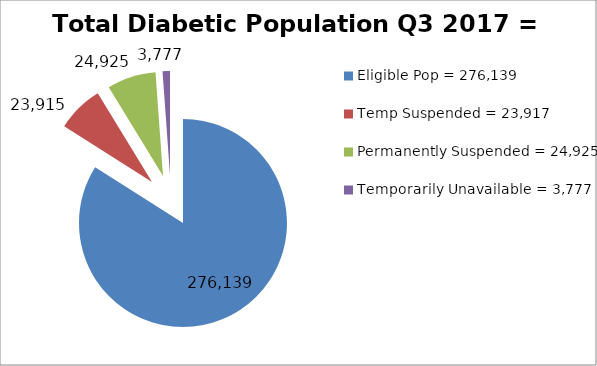
| Category | Total Diabetic Population Q3 2017 = 321,202 |
|---|---|
| Eligible Pop = 276,139 | 276139 |
| Temp Suspended = 23,917 | 23915 |
| Permanently Suspended = 24,925 | 24925 |
| Temporarily Unavailable = 3,777 | 3777 |